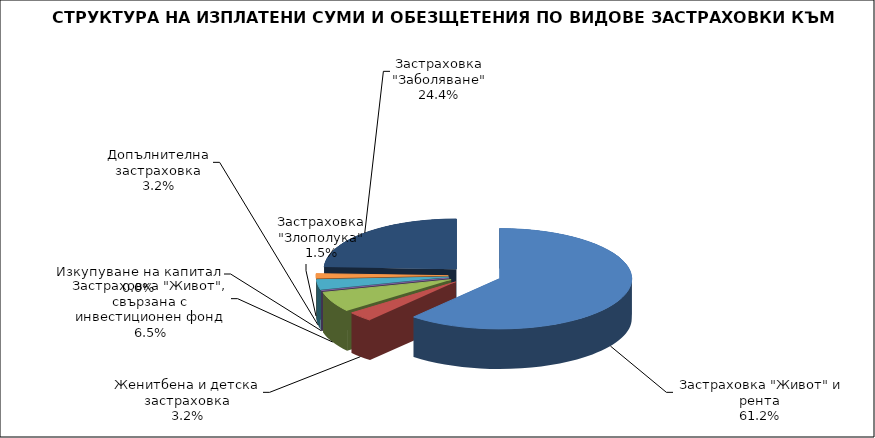
| Category | Series 0 |
|---|---|
|  Застраховка "Живот" и рента | 74416856.654 |
| Женитбена и детска застраховка | 3872476.761 |
| Застраховка "Живот", свързана с инвестиционен фонд | 7920436.832 |
| Изкупуване на капитал | 0 |
| Допълнителна застраховка | 3922762.13 |
| Застраховка "Злополука" | 1832022.036 |
| Застраховка "Заболяване" | 29616621.072 |